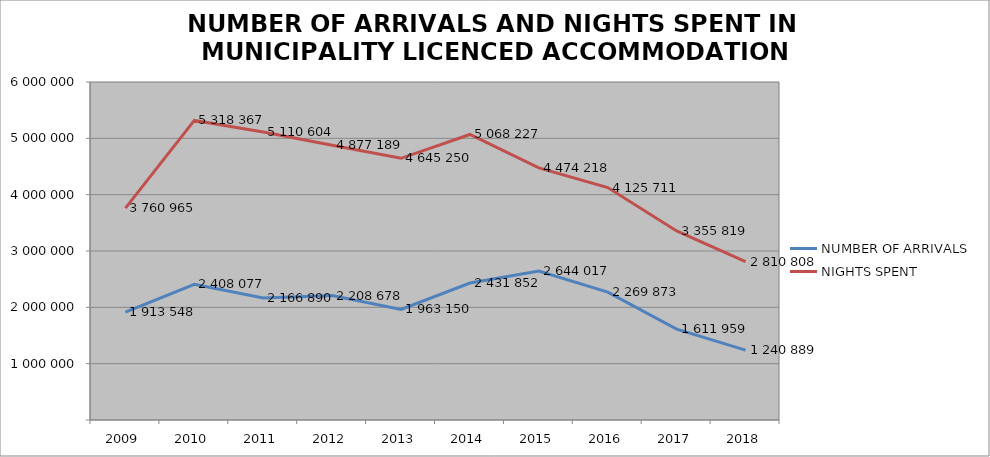
| Category | NUMBER OF ARRIVALS | NIGHTS SPENT |
|---|---|---|
| 2009 | 1913548 | 3760965 |
| 2010 | 2408077 | 5318367 |
| 2011 | 2166890 | 5110604 |
| 2012 | 2208678 | 4877189 |
| 2013 | 1963150 | 4645250 |
| 2014 | 2431852 | 5068227 |
| 2015 | 2644017 | 4474218 |
| 2016 | 2269873 | 4125711 |
| 2017 | 1611959 | 3355819 |
| 2018 | 1240889 | 2810808 |